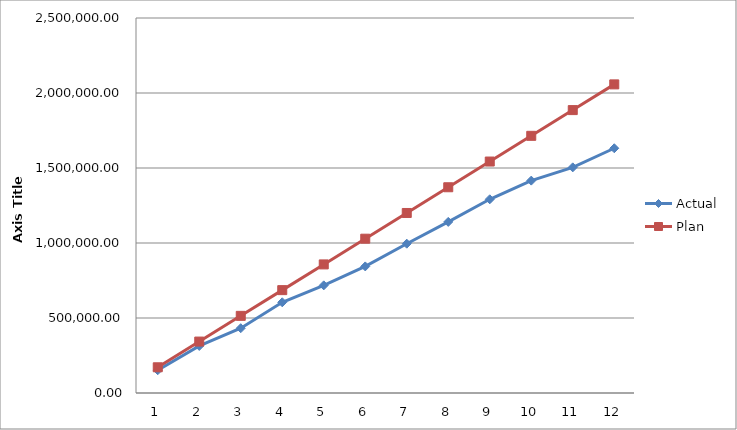
| Category | Actual | Plan |
|---|---|---|
| 0 | 151843.09 | 171454.667 |
| 1 | 313708.89 | 342909.333 |
| 2 | 431997.55 | 514364 |
| 3 | 604749.25 | 685818.667 |
| 4 | 717699.96 | 857273.333 |
| 5 | 843866.07 | 1028728 |
| 6 | 995339.96 | 1200182.667 |
| 7 | 1140665.96 | 1371637.333 |
| 8 | 1291377.31 | 1543092 |
| 9 | 1415921.43 | 1714546.667 |
| 10 | 1504367.91 | 1886001.333 |
| 11 | 1631655.47 | 2057456 |